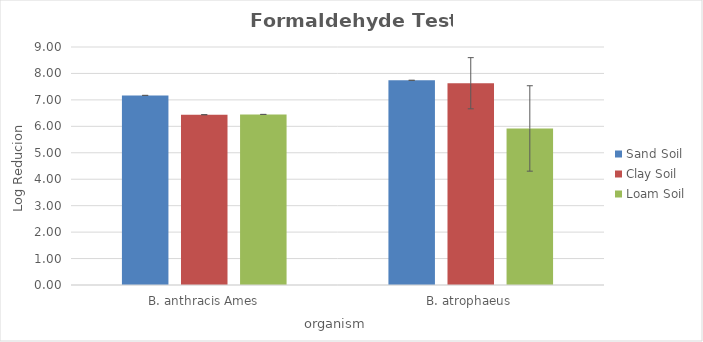
| Category | Sand Soil | Clay Soil | Loam Soil |
|---|---|---|---|
| B. anthracis Ames | 7.17 | 6.44 | 6.45 |
| B. atrophaeus | 7.74 | 7.63 | 5.92 |